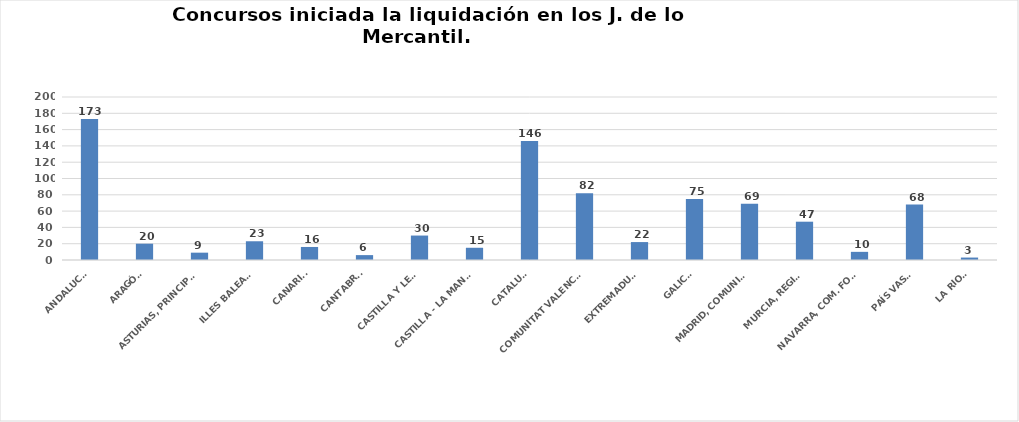
| Category | Series 0 |
|---|---|
| ANDALUCÍA | 173 |
| ARAGÓN | 20 |
| ASTURIAS, PRINCIPADO | 9 |
| ILLES BALEARS | 23 |
| CANARIAS | 16 |
| CANTABRIA | 6 |
| CASTILLA Y LEÓN | 30 |
| CASTILLA - LA MANCHA | 15 |
| CATALUÑA | 146 |
| COMUNITAT VALENCIANA | 82 |
| EXTREMADURA | 22 |
| GALICIA | 75 |
| MADRID, COMUNIDAD | 69 |
| MURCIA, REGIÓN | 47 |
| NAVARRA, COM. FORAL | 10 |
| PAÍS VASCO | 68 |
| LA RIOJA | 3 |